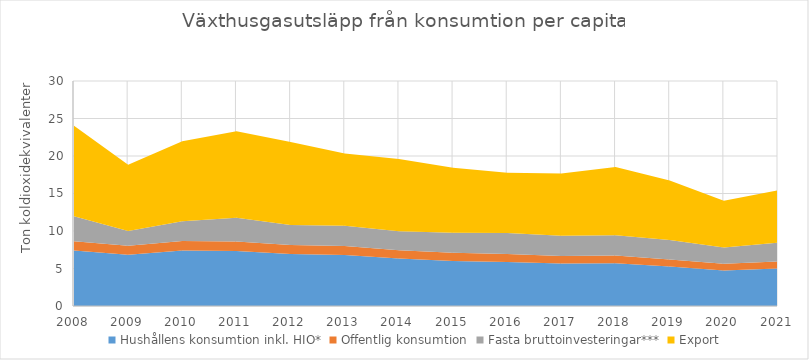
| Category | Hushållens konsumtion inkl. HIO* | Offentlig konsumtion | Fasta bruttoinvesteringar*** | Export |
|---|---|---|---|---|
| 2008.0 | 7.403 | 1.239 | 3.309 | 12.078 |
| 2009.0 | 6.837 | 1.193 | 1.965 | 8.84 |
| 2010.0 | 7.396 | 1.255 | 2.633 | 10.673 |
| 2011.0 | 7.331 | 1.253 | 3.179 | 11.531 |
| 2012.0 | 6.931 | 1.199 | 2.66 | 11.071 |
| 2013.0 | 6.8 | 1.195 | 2.712 | 9.642 |
| 2014.0 | 6.347 | 1.073 | 2.552 | 9.639 |
| 2015.0 | 6.014 | 1.086 | 2.679 | 8.664 |
| 2016.0 | 5.859 | 1.083 | 2.776 | 8.033 |
| 2017.0 | 5.669 | 1.007 | 2.681 | 8.311 |
| 2018.0 | 5.702 | 1.032 | 2.701 | 9.115 |
| 2019.0 | 5.269 | 0.936 | 2.595 | 7.942 |
| 2020.0 | 4.732 | 0.894 | 2.18 | 6.217 |
| 2021.0 | 4.999 | 0.943 | 2.496 | 7 |